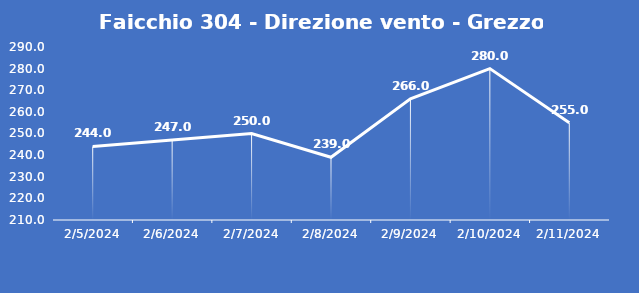
| Category | Faicchio 304 - Direzione vento - Grezzo (°N) |
|---|---|
| 2/5/24 | 244 |
| 2/6/24 | 247 |
| 2/7/24 | 250 |
| 2/8/24 | 239 |
| 2/9/24 | 266 |
| 2/10/24 | 280 |
| 2/11/24 | 255 |